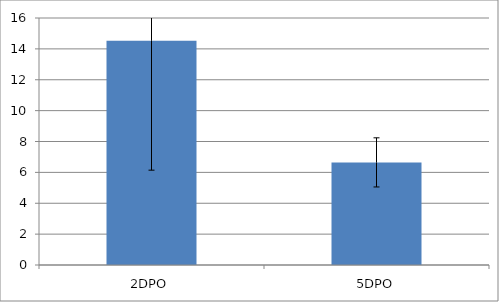
| Category | Series 0 |
|---|---|
| 2DPO | 14.525 |
| 5DPO | 6.646 |